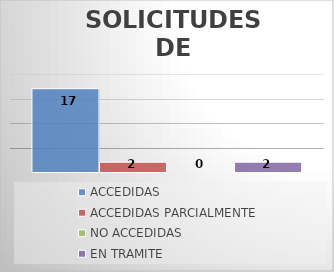
| Category | ACCEDIDAS | ACCEDIDAS PARCIALMENTE | NO ACCEDIDAS | EN TRAMITE |
|---|---|---|---|---|
| 0 | 17 | 2 | 0 | 2 |